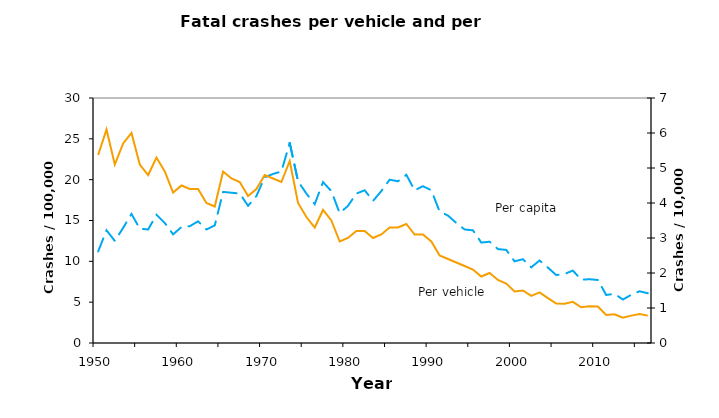
| Category | Series 0 |
|---|---|
| 1950.0 | 11.211 |
| 1951.0 | 13.8 |
| 1952.0 | 12.5 |
| 1953.0 | 14.1 |
| 1954.0 | 15.8 |
| 1955.0 | 14 |
| 1956.0 | 13.9 |
| 1957.0 | 15.7 |
| 1958.0 | 14.7 |
| 1959.0 | 13.3 |
| 1960.0 | 14.2 |
| 1961.0 | 14.3 |
| 1962.0 | 14.9 |
| 1963.0 | 13.9 |
| 1964.0 | 14.4 |
| 1965.0 | 18.5 |
| 1966.0 | 18.4 |
| 1967.0 | 18.3 |
| 1968.0 | 16.8 |
| 1969.0 | 18 |
| 1970.0 | 20.3 |
| 1971.0 | 20.7 |
| 1972.0 | 21 |
| 1973.0 | 24.5 |
| 1974.0 | 19.8 |
| 1975.0 | 18.3 |
| 1976.0 | 17 |
| 1977.0 | 19.7 |
| 1978.0 | 18.6 |
| 1979.0 | 15.9 |
| 1980.0 | 16.8 |
| 1981.0 | 18.3 |
| 1982.0 | 18.7 |
| 1983.0 | 17.4 |
| 1984.0 | 18.6 |
| 1985.0 | 20 |
| 1986.0 | 19.8 |
| 1987.0 | 20.6 |
| 1988.0 | 18.7 |
| 1989.0 | 19.2 |
| 1990.0 | 18.7 |
| 1991.0 | 16.1 |
| 1992.0 | 15.6 |
| 1993.0 | 14.7 |
| 1994.0 | 13.9 |
| 1995.0 | 13.8 |
| 1996.0 | 12.3 |
| 1997.0 | 12.4 |
| 1998.0 | 11.5 |
| 1999.0 | 11.4 |
| 2000.0 | 9.998 |
| 2001.0 | 10.259 |
| 2002.0 | 9.266 |
| 2003.0 | 10.102 |
| 2004.0 | 9.234 |
| 2005.0 | 8.321 |
| 2006.0 | 8.455 |
| 2007.0 | 8.869 |
| 2008.0 | 7.754 |
| 2009.0 | 7.809 |
| 2010.0 | 7.716 |
| 2011.0 | 5.879 |
| 2012.0 | 6.023 |
| 2013.0 | 5.323 |
| 2014.0 | 5.898 |
| 2015.0 | 6.331 |
| 2016.0 | 6.094 |